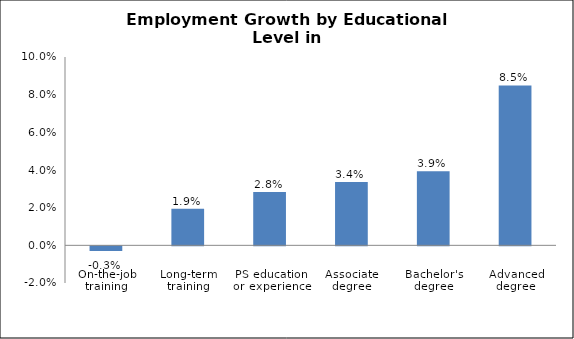
| Category | Series 0 |
|---|---|
| On-the-job training | -0.003 |
| Long-term training | 0.019 |
| PS education or experience | 0.028 |
| Associate degree | 0.034 |
| Bachelor's degree | 0.039 |
| Advanced degree | 0.085 |